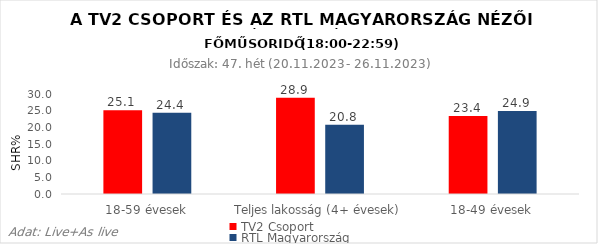
| Category | TV2 Csoport | RTL Magyarország |
|---|---|---|
| 18-59 évesek | 25.1 | 24.4 |
| Teljes lakosság (4+ évesek) | 28.9 | 20.8 |
| 18-49 évesek | 23.4 | 24.9 |